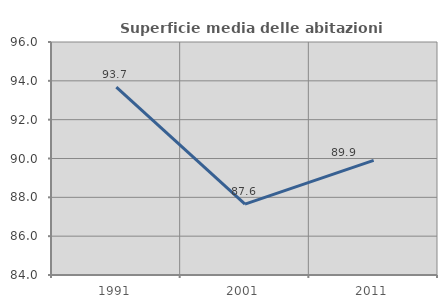
| Category | Superficie media delle abitazioni occupate |
|---|---|
| 1991.0 | 93.678 |
| 2001.0 | 87.648 |
| 2011.0 | 89.9 |